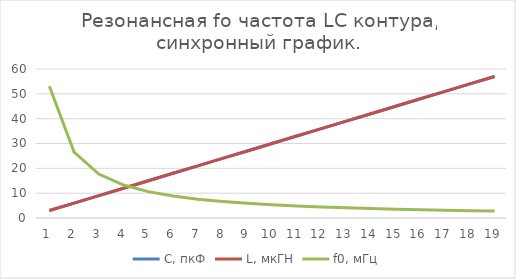
| Category | C, пкФ | L, мкГН | f0, мГц |
|---|---|---|---|
| 0 | 3 | 3 | 53.052 |
| 1 | 6 | 6 | 26.526 |
| 2 | 9 | 9 | 17.684 |
| 3 | 12 | 12 | 13.263 |
| 4 | 15 | 15 | 10.61 |
| 5 | 18 | 18 | 8.842 |
| 6 | 21 | 21 | 7.579 |
| 7 | 24 | 24 | 6.631 |
| 8 | 27 | 27 | 5.895 |
| 9 | 30 | 30 | 5.305 |
| 10 | 33 | 33 | 4.823 |
| 11 | 36 | 36 | 4.421 |
| 12 | 39 | 39 | 4.081 |
| 13 | 42 | 42 | 3.789 |
| 14 | 45 | 45 | 3.537 |
| 15 | 48 | 48 | 3.316 |
| 16 | 51 | 51 | 3.121 |
| 17 | 54 | 54 | 2.947 |
| 18 | 57 | 57 | 2.792 |